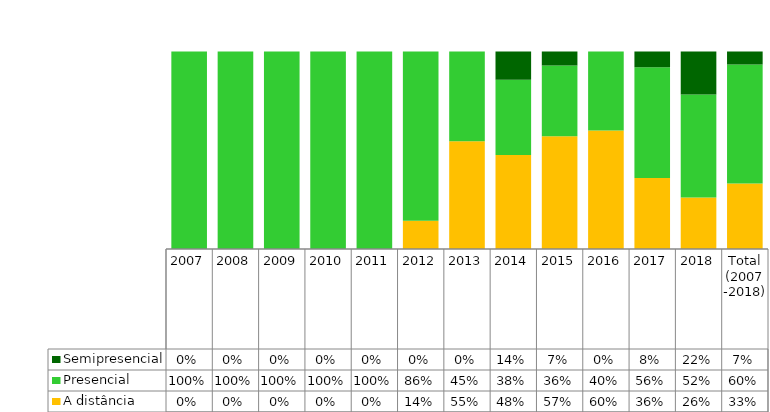
| Category | A distância | Presencial | Semipresencial |
|---|---|---|---|
| 2007 | 0 | 1 | 0 |
| 2008 | 0 | 1 | 0 |
| 2009 | 0 | 1 | 0 |
| 2010 | 0 | 1 | 0 |
| 2011 | 0 | 1 | 0 |
| 2012 | 0.143 | 0.857 | 0 |
| 2013 | 0.545 | 0.455 | 0 |
| 2014 | 0.476 | 0.381 | 0.143 |
| 2015 | 0.571 | 0.357 | 0.071 |
| 2016 | 0.6 | 0.4 | 0 |
| 2017 | 0.36 | 0.56 | 0.08 |
| 2018 | 0.261 | 0.522 | 0.217 |
| Total (2007 -2018) | 0.331 | 0.602 | 0.066 |